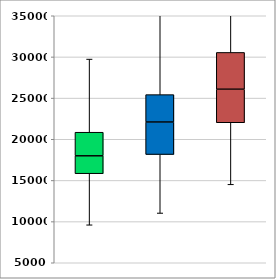
| Category | Series 0 | Series 1 | Series 2 | Series 3 |
|---|---|---|---|---|
| 0 | 9610.946 | 6204.218 | 2173.348 | 2866.896 |
| 1 | 11044.655 | 7100.453 | 3949.216 | 3327.705 |
| 2 | 14526.817 | 7477.14 | 4071.362 | 4471.982 |